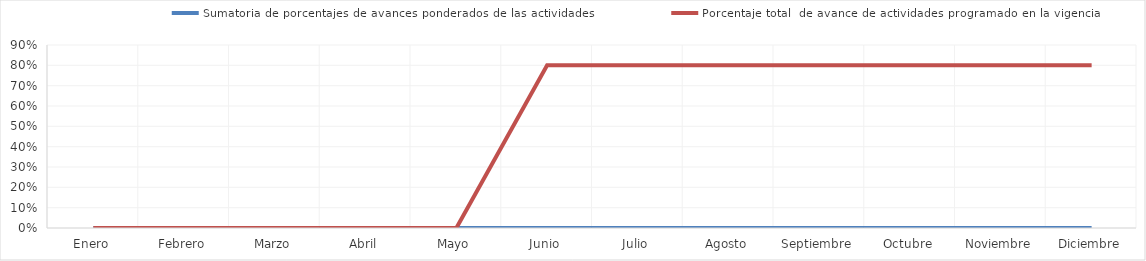
| Category | Sumatoria de porcentajes de avances ponderados de las actividades | Porcentaje total  de avance de actividades programado en la vigencia |
|---|---|---|
| 0 | 0 | 0 |
| 1 | 0 | 0 |
| 2 | 0 | 0 |
| 3 | 0 | 0 |
| 4 | 0 | 0 |
| 5 | 0 | 0.8 |
| 6 | 0 | 0.8 |
| 7 | 0 | 0.8 |
| 8 | 0 | 0.8 |
| 9 | 0 | 0.8 |
| 10 | 0 | 0.8 |
| 11 | 0 | 0.8 |